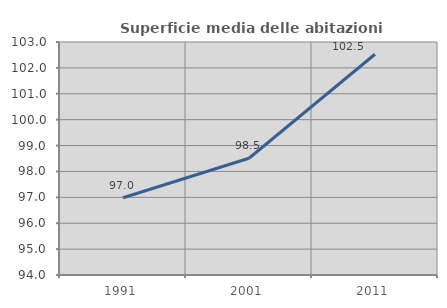
| Category | Superficie media delle abitazioni occupate |
|---|---|
| 1991.0 | 96.985 |
| 2001.0 | 98.509 |
| 2011.0 | 102.526 |